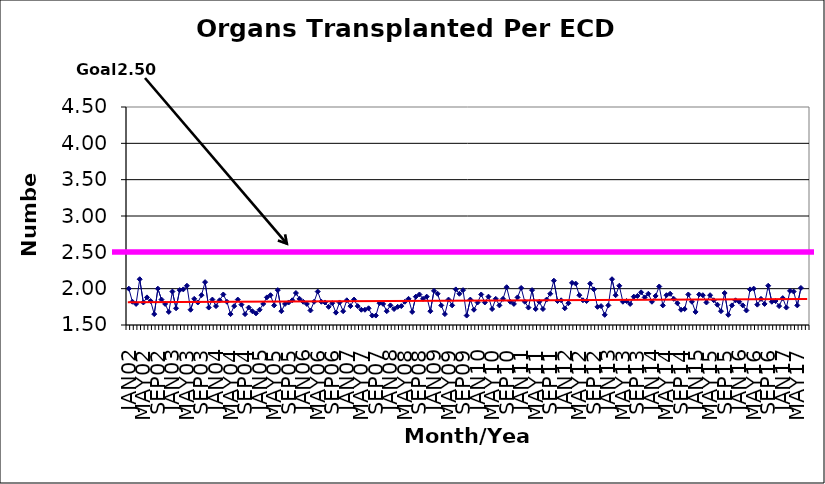
| Category | Series 0 |
|---|---|
| JAN02 | 2 |
| FEB02 | 1.82 |
| MAR02 | 1.79 |
| APR02 | 2.13 |
| MAY02 | 1.81 |
| JUN02 | 1.88 |
| JUL02 | 1.83 |
| AUG02 | 1.65 |
| SEP02 | 2 |
| OCT02 | 1.85 |
| NOV02 | 1.79 |
| DEC02 | 1.68 |
| JAN03 | 1.96 |
| FEB03 | 1.73 |
| MAR03 | 1.98 |
| APR03 | 1.99 |
| MAY03 | 2.04 |
| JUN03 | 1.71 |
| JUL03 | 1.86 |
| AUG03 | 1.81 |
| SEP03 | 1.91 |
| OCT03 | 2.09 |
| NOV03 | 1.74 |
| DEC03 | 1.85 |
| JAN04 | 1.76 |
| FEB04 | 1.84 |
| MAR04 | 1.92 |
| APR04 | 1.82 |
| MAY04 | 1.65 |
| JUN04 | 1.76 |
| JUL04 | 1.85 |
| AUG04 | 1.78 |
| SEP04 | 1.65 |
| OCT04 | 1.74 |
| NOV04 | 1.69 |
| DEC04 | 1.66 |
| JAN05 | 1.71 |
| FEB05 | 1.79 |
| MAR05 | 1.88 |
| APR05 | 1.91 |
| MAY05 | 1.77 |
| JUN05 | 1.98 |
| JUL05 | 1.69 |
| AUG05 | 1.79 |
| SEP05 | 1.81 |
| OCT05 | 1.84 |
| NOV05 | 1.94 |
| DEC05 | 1.86 |
| JAN06 | 1.82 |
| FEB06 | 1.79 |
| MAR06 | 1.7 |
| APR06 | 1.82 |
| MAY06 | 1.96 |
| JUN06 | 1.82 |
| JUL06 | 1.81 |
| AUG06 | 1.75 |
| SEP06 | 1.8 |
| OCT06 | 1.67 |
| NOV06 | 1.81 |
| DEC06 | 1.69 |
| JAN07 | 1.84 |
| FEB07 | 1.76 |
| MAR07 | 1.85 |
| APR07 | 1.76 |
| MAY07 | 1.71 |
| JUN07 | 1.71 |
| JUL07 | 1.73 |
| AUG07 | 1.63 |
| SEP07 | 1.63 |
| OCT07 | 1.8 |
| NOV07 | 1.79 |
| DEC07 | 1.69 |
| JAN08 | 1.77 |
| FEB08 | 1.72 |
| MAR08 | 1.75 |
| APR08 | 1.76 |
| MAY08 | 1.82 |
| JUN08 | 1.86 |
| JUL08 | 1.68 |
| AUG08 | 1.89 |
| SEP08 | 1.92 |
| OCT08 | 1.86 |
| NOV08 | 1.89 |
| DEC08 | 1.69 |
| JAN09 | 1.97 |
| FEB09 | 1.93 |
| MAR09 | 1.77 |
| APR09 | 1.65 |
| MAY09 | 1.85 |
| JUN09 | 1.77 |
| JUL09 | 1.99 |
| AUG09 | 1.93 |
| SEP09 | 1.98 |
| OCT09 | 1.63 |
| NOV09 | 1.85 |
| DEC09 | 1.71 |
| JAN10 | 1.81 |
| FEB10 | 1.92 |
| MAR10 | 1.81 |
| APR10 | 1.89 |
| MAY10 | 1.72 |
| JUN10 | 1.86 |
| JUL10 | 1.77 |
| AUG10 | 1.86 |
| SEP10 | 2.02 |
| OCT10 | 1.82 |
| NOV10 | 1.79 |
| DEC10 | 1.88 |
| JAN11 | 2.01 |
| FEB11 | 1.82 |
| MAR11 | 1.74 |
| APR11 | 1.98 |
| MAY11 | 1.72 |
| JUN11 | 1.82 |
| JUL11 | 1.72 |
| AUG11 | 1.85 |
| SEP11 | 1.93 |
| OCT11 | 2.11 |
| NOV11 | 1.83 |
| DEC11 | 1.84 |
| JAN12 | 1.73 |
| FEB12 | 1.8 |
| MAR12 | 2.08 |
| APR12 | 2.07 |
| MAY12 | 1.91 |
| JUN12 | 1.84 |
| JUL12 | 1.83 |
| AUG12 | 2.07 |
| SEP12 | 1.99 |
| OCT12 | 1.75 |
| NOV12 | 1.76 |
| DEC12 | 1.64 |
| JAN13 | 1.77 |
| FEB13 | 2.13 |
| MAR13 | 1.91 |
| APR13 | 2.04 |
| MAY13 | 1.82 |
| JUN13 | 1.83 |
| JUL13 | 1.79 |
| AUG13 | 1.89 |
| SEP13 | 1.9 |
| OCT13 | 1.95 |
| NOV13 | 1.88 |
| DEC13 | 1.93 |
| JAN14 | 1.82 |
| FEB14 | 1.9 |
| MAR14 | 2.03 |
| APR14 | 1.77 |
| MAY14 | 1.91 |
| JUN14 | 1.93 |
| JUL14 | 1.86 |
| AUG14 | 1.8 |
| SEP14 | 1.71 |
| OCT14 | 1.72 |
| NOV14 | 1.92 |
| DEC14 | 1.82 |
| JAN15 | 1.68 |
| FEB15 | 1.92 |
| MAR15 | 1.91 |
| APR15 | 1.81 |
| MAY15 | 1.91 |
| JUN15 | 1.84 |
| JUL15 | 1.78 |
| AUG15 | 1.69 |
| SEP15 | 1.94 |
| OCT15 | 1.64 |
| NOV15 | 1.77 |
| DEC15 | 1.84 |
| JAN16 | 1.82 |
| FEB16 | 1.77 |
| MAR16 | 1.7 |
| APR16 | 1.99 |
| MAY16 | 2 |
| JUN16 | 1.78 |
| JUL16 | 1.86 |
| AUG16 | 1.79 |
| SEP16 | 2.04 |
| OCT16 | 1.82 |
| NOV16 | 1.83 |
| DEC16 | 1.76 |
| JAN17 | 1.87 |
| FEB17 | 1.74 |
| MAR17 | 1.97 |
| APR17 | 1.96 |
| MAY17 | 1.77 |
| JUN17 | 2.01 |